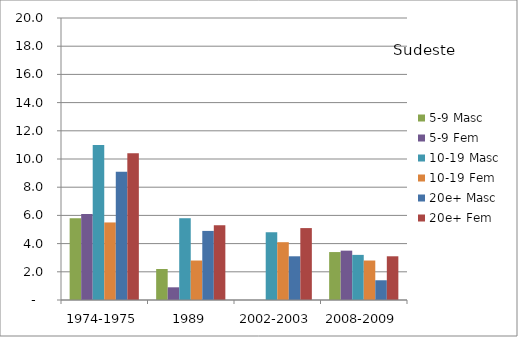
| Category | 5-9 Masc | 5-9 Fem | 10-19 Masc | 10-19 Fem | 20e+ Masc | 20e+ Fem |
|---|---|---|---|---|---|---|
| 1974-1975 | 5.8 | 6.1 | 11 | 5.5 | 9.1 | 10.4 |
| 1989 | 2.2 | 0.9 | 5.8 | 2.8 | 4.9 | 5.3 |
| 2002-2003 | 0 | 0 | 4.8 | 4.1 | 3.1 | 5.1 |
| 2008-2009 | 3.4 | 3.5 | 3.2 | 2.8 | 1.4 | 3.1 |